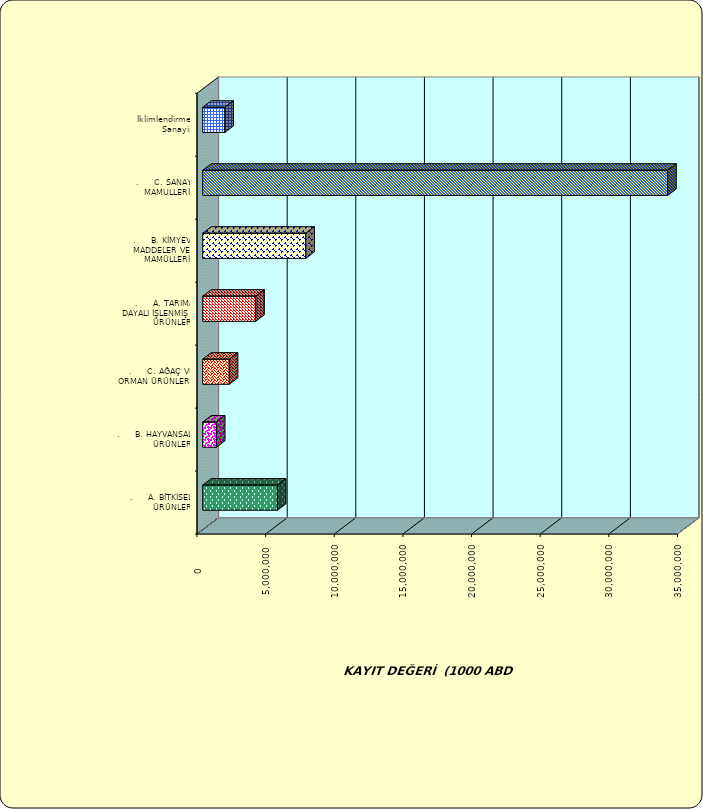
| Category | Series 0 |
|---|---|
| .     A. BİTKİSEL ÜRÜNLER | 5441540.452 |
| .     B. HAYVANSAL ÜRÜNLER | 999698.569 |
| .     C. AĞAÇ VE ORMAN ÜRÜNLERİ | 1933279.052 |
| .     A. TARIMA DAYALI İŞLENMİŞ ÜRÜNLER | 3863052.787 |
| .     B. KİMYEVİ MADDELER VE MAMÜLLERİ | 7510792.094 |
| .     C. SANAYİ MAMULLERİ | 33873331.352 |
|  İklimlendirme Sanayii | 1613758.918 |